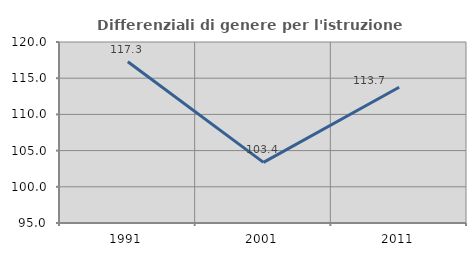
| Category | Differenziali di genere per l'istruzione superiore |
|---|---|
| 1991.0 | 117.268 |
| 2001.0 | 103.369 |
| 2011.0 | 113.75 |